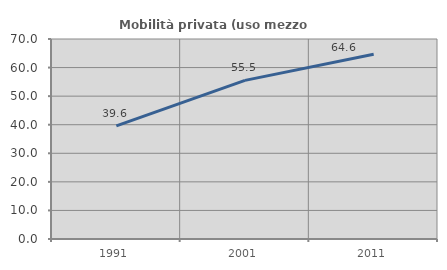
| Category | Mobilità privata (uso mezzo privato) |
|---|---|
| 1991.0 | 39.577 |
| 2001.0 | 55.528 |
| 2011.0 | 64.63 |